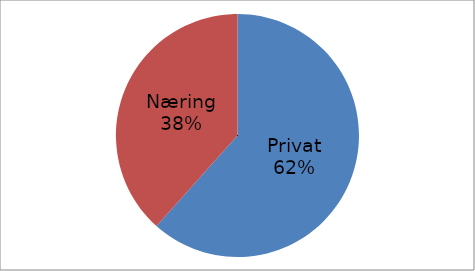
| Category | Series 0 |
|---|---|
| Privat | 48183766 |
| Næring | 30013921 |